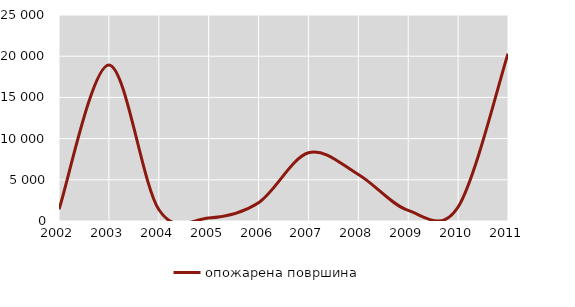
| Category | опожарена површина |
|---|---|
| 2002.0 | 1426 |
| 2003.0 | 18942 |
| 2004.0 | 1391 |
| 2005.0 | 360 |
| 2006.0 | 2224 |
| 2007.0 | 8279 |
| 2008.0 | 5646 |
| 2009.0 | 1281 |
| 2010.0 | 1698 |
| 2011.0 | 20312 |